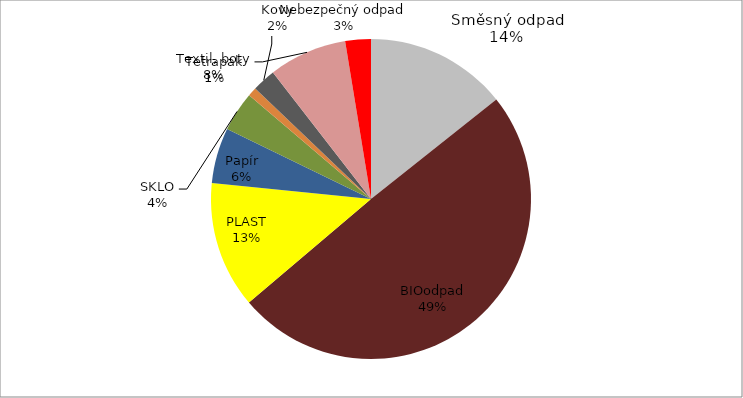
| Category | Series 0 | Series 1 |
|---|---|---|
| SKO | 57 | 27.066 |
| BIOodpad | 197 | 38.788 |
| PLAST | 50.9 | 13.985 |
| Papír | 22.3 | 9.314 |
| SKLO | 16 | 3.46 |
| Tetrapak | 3.6 | 0.993 |
| Kovy | 9.45 | 2.336 |
| Textil, boty | 31.5 | 3.679 |
| Nebezpečný odpad | 10.3 | 0.38 |